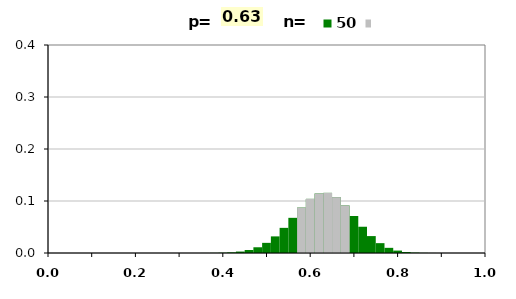
| Category | 50 |
|---|---|
| 0.0 | -1 |
| 0.02 | -1 |
| 0.04 | -1 |
| 0.06 | -1 |
| 0.08 | -1 |
| 0.1 | -1 |
| 0.12 | -1 |
| 0.14 | -1 |
| 0.16 | -1 |
| 0.18 | -1 |
| 0.2 | -1 |
| 0.22 | -1 |
| 0.24 | -1 |
| 0.26 | -1 |
| 0.28 | -1 |
| 0.3 | -1 |
| 0.32 | -1 |
| 0.34 | -1 |
| 0.36 | -1 |
| 0.38 | -1 |
| 0.4 | -1 |
| 0.42 | -1 |
| 0.44 | -1 |
| 0.46 | -1 |
| 0.48 | -1 |
| 0.5 | -1 |
| 0.52 | -1 |
| 0.54 | -1 |
| 0.56 | -1 |
| 0.58 | 0.087 |
| 0.6 | 0.104 |
| 0.62 | 0.114 |
| 0.64 | 0.116 |
| 0.66 | 0.107 |
| 0.68 | 0.091 |
| 0.7 | -1 |
| 0.72 | -1 |
| 0.74 | -1 |
| 0.76 | -1 |
| 0.78 | -1 |
| 0.8 | -1 |
| 0.82 | -1 |
| 0.84 | -1 |
| 0.86 | -1 |
| 0.88 | -1 |
| 0.9 | -1 |
| 0.92 | -1 |
| 0.94 | -1 |
| 0.96 | -1 |
| 0.98 | -1 |
| 1.0 | -1 |